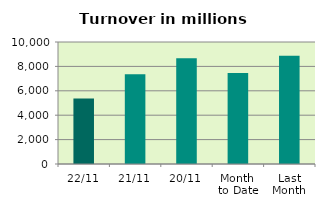
| Category | Series 0 |
|---|---|
| 22/11 | 5370.064 |
| 21/11 | 7347.38 |
| 20/11 | 8667.809 |
| Month 
to Date | 7465.498 |
| Last
Month | 8866.758 |